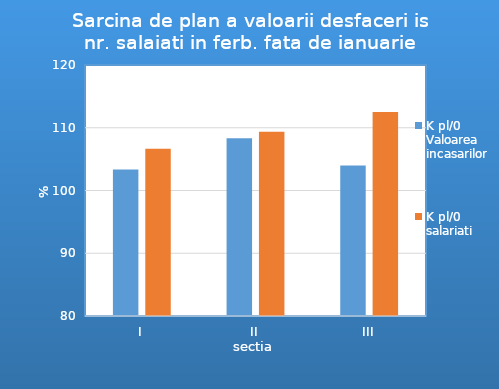
| Category | K pl/0 Valoarea incasarilor | K pl/0 salariati |
|---|---|---|
| I | 103.333 | 106.667 |
| II | 108.333 | 109.375 |
| III | 104 | 112.5 |